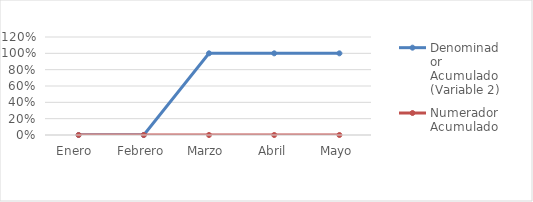
| Category | Denominador Acumulado (Variable 2) | Numerador Acumulado (Variable 1) |
|---|---|---|
| Enero  | 0 | 0 |
| Febrero | 0 | 0 |
| Marzo | 1 | 0 |
| Abril | 1 | 0 |
| Mayo | 1 | 0 |